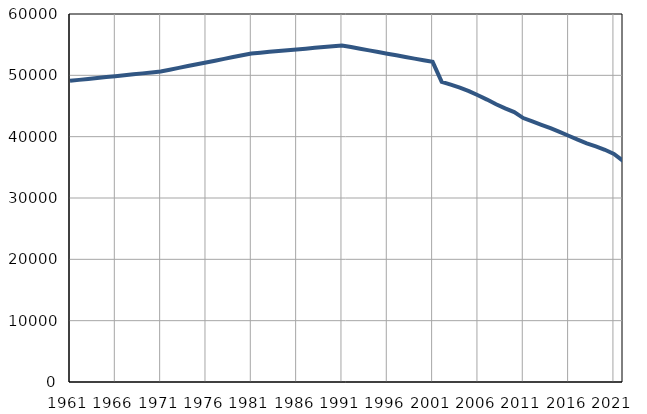
| Category | Број
становника |
|---|---|
| 1961.0 | 49107 |
| 1962.0 | 49259 |
| 1963.0 | 49410 |
| 1964.0 | 49562 |
| 1965.0 | 49714 |
| 1966.0 | 49866 |
| 1967.0 | 50017 |
| 1968.0 | 50169 |
| 1969.0 | 50321 |
| 1970.0 | 50472 |
| 1971.0 | 50624 |
| 1972.0 | 50918 |
| 1973.0 | 51213 |
| 1974.0 | 51508 |
| 1975.0 | 51802 |
| 1976.0 | 52097 |
| 1977.0 | 52391 |
| 1978.0 | 52686 |
| 1979.0 | 52981 |
| 1980.0 | 53275 |
| 1981.0 | 53570 |
| 1982.0 | 53700 |
| 1983.0 | 53831 |
| 1984.0 | 53961 |
| 1985.0 | 54091 |
| 1986.0 | 54222 |
| 1987.0 | 54352 |
| 1988.0 | 54482 |
| 1989.0 | 54612 |
| 1990.0 | 54743 |
| 1991.0 | 54873 |
| 1992.0 | 54605 |
| 1993.0 | 54337 |
| 1994.0 | 54069 |
| 1995.0 | 53801 |
| 1996.0 | 53533 |
| 1997.0 | 53265 |
| 1998.0 | 52997 |
| 1999.0 | 52729 |
| 2000.0 | 52461 |
| 2001.0 | 52193 |
| 2002.0 | 48944 |
| 2003.0 | 48474 |
| 2004.0 | 47990 |
| 2005.0 | 47422 |
| 2006.0 | 46758 |
| 2007.0 | 46046 |
| 2008.0 | 45287 |
| 2009.0 | 44610 |
| 2010.0 | 43998 |
| 2011.0 | 43031 |
| 2012.0 | 42475 |
| 2013.0 | 41939 |
| 2014.0 | 41381 |
| 2015.0 | 40777 |
| 2016.0 | 40145 |
| 2017.0 | 39510 |
| 2018.0 | 38915 |
| 2019.0 | 38401 |
| 2020.0 | 37862 |
| 2021.0 | 37181 |
| 2022.0 | 36055 |